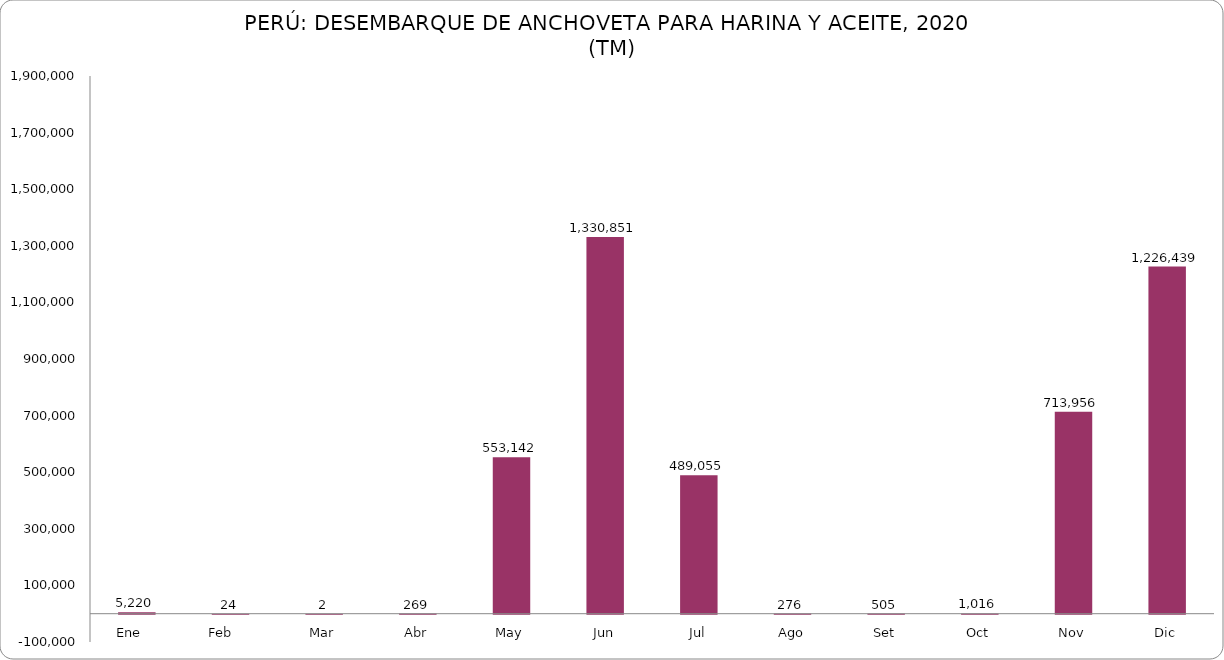
| Category | Series 0 |
|---|---|
| Ene    | 5220.4 |
| Feb     | 24.43 |
| Mar | 2.36 |
| Abr | 268.5 |
| May | 553142.23 |
| Jun | 1330850.74 |
| Jul | 489055.35 |
| Ago | 275.56 |
| Set | 505.1 |
| Oct | 1016.07 |
| Nov | 713956.03 |
| Dic | 1226439.37 |